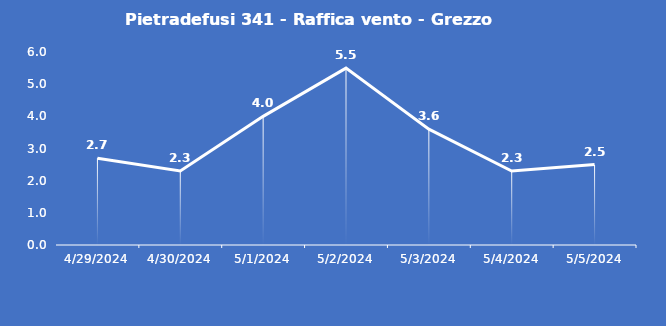
| Category | Pietradefusi 341 - Raffica vento - Grezzo (m/s) |
|---|---|
| 4/29/24 | 2.7 |
| 4/30/24 | 2.3 |
| 5/1/24 | 4 |
| 5/2/24 | 5.5 |
| 5/3/24 | 3.6 |
| 5/4/24 | 2.3 |
| 5/5/24 | 2.5 |